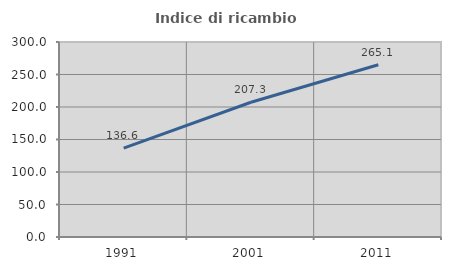
| Category | Indice di ricambio occupazionale  |
|---|---|
| 1991.0 | 136.624 |
| 2001.0 | 207.317 |
| 2011.0 | 265.072 |